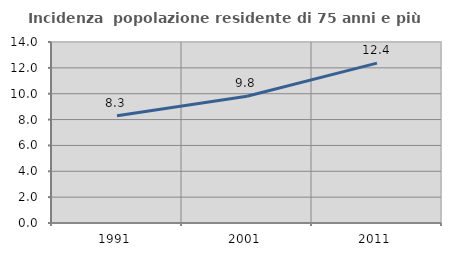
| Category | Incidenza  popolazione residente di 75 anni e più |
|---|---|
| 1991.0 | 8.293 |
| 2001.0 | 9.805 |
| 2011.0 | 12.363 |